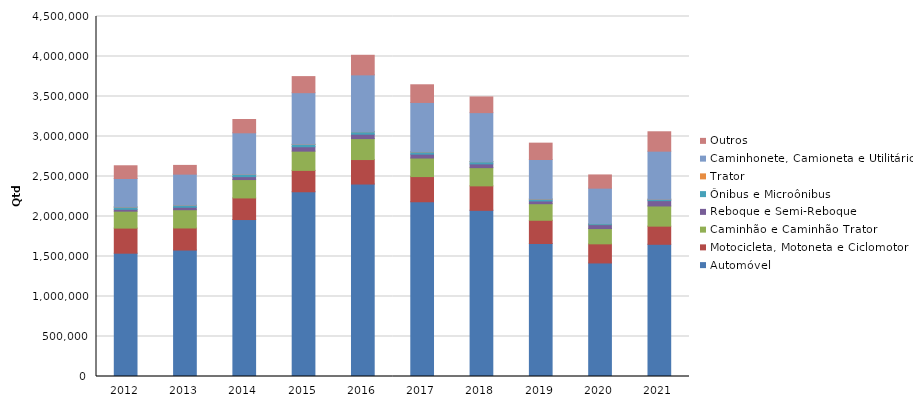
| Category | Automóvel | Motocicleta, Motoneta e Ciclomotor | Caminhão e Caminhão Trator | Reboque e Semi-Reboque | Ônibus e Microônibus | Trator | Caminhonete, Camioneta e Utilitário | Outros |
|---|---|---|---|---|---|---|---|---|
| 2012 | 1541384 | 313616 | 211857 | 23243 | 28085 | 324 | 356747 | 158815 |
| 2013 | 1580581 | 275832 | 228213 | 31004 | 26099 | 363 | 387345 | 109335 |
| 2014 | 1961906 | 269983 | 229659 | 36442 | 29400 | 338 | 518324 | 166837 |
| 2015 | 2309098 | 267309 | 240532 | 54709 | 29784 | 320 | 645943 | 200969 |
| 2016 | 2405726 | 306169 | 261962 | 54538 | 31497 | 274 | 710332 | 244786 |
| 2017 | 2184131 | 314806 | 231852 | 48490 | 28499 | 217 | 617588 | 220918 |
| 2018 | 2077086 | 305895 | 227444 | 47244 | 27728 | 270 | 612662 | 196222 |
| 2019 | 1662785 | 290173 | 206872 | 34366 | 23212 | 249 | 495119 | 204207 |
| 2020 | 1419324 | 239004 | 190713 | 49331 | 12975 | 244 | 442845 | 165155 |
| 2021 | 1652420 | 226972 | 252147 | 66882 | 16928 | 276 | 601072 | 242371 |